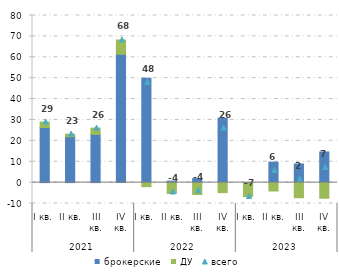
| Category | брокерские | ДУ |
|---|---|---|
| 0 | 26.396 | 2.607 |
| 1 | 21.967 | 1.244 |
| 2 | 23.116 | 2.977 |
| 3 | 61.451 | 6.822 |
| 4 | 50.01 | -1.939 |
| 5 | 0.709 | -5.203 |
| 6 | 1.929 | -5.694 |
| 7 | 30.869 | -4.802 |
| 8 | -0.22 | -6.422 |
| 9 | 9.802 | -4.009 |
| 10 | 8.904 | -7.237 |
| 11 | 14.682 | -7.481 |